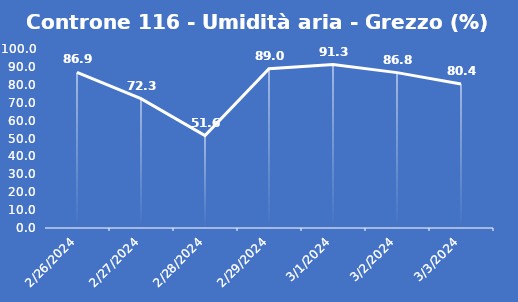
| Category | Controne 116 - Umidità aria - Grezzo (%) |
|---|---|
| 2/26/24 | 86.9 |
| 2/27/24 | 72.3 |
| 2/28/24 | 51.6 |
| 2/29/24 | 89 |
| 3/1/24 | 91.3 |
| 3/2/24 | 86.8 |
| 3/3/24 | 80.4 |